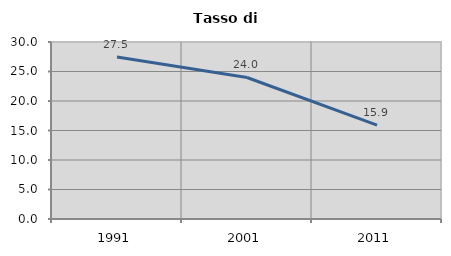
| Category | Tasso di disoccupazione   |
|---|---|
| 1991.0 | 27.457 |
| 2001.0 | 23.988 |
| 2011.0 | 15.897 |